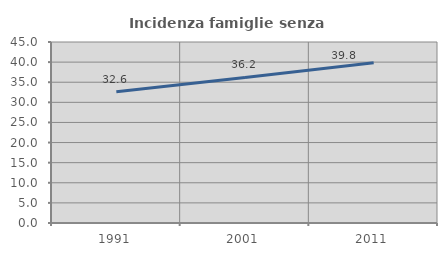
| Category | Incidenza famiglie senza nuclei |
|---|---|
| 1991.0 | 32.616 |
| 2001.0 | 36.187 |
| 2011.0 | 39.831 |